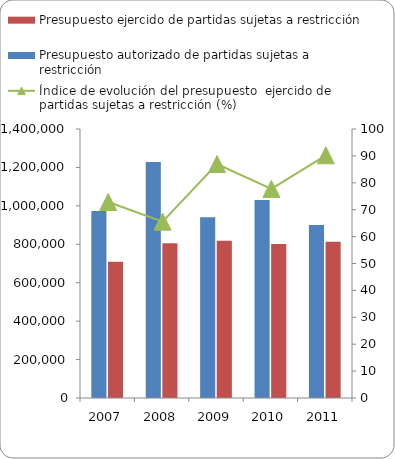
| Category | Presupuesto autorizado de partidas sujetas a restricción | Presupuesto ejercido de partidas sujetas a restricción  |
|---|---|---|
| 2007 | 973360 | 709175 |
| 2008 | 1227735 | 804875 |
| 2009 | 941182 | 818576 |
| 2010 | 1031124 | 801583 |
| 2011 | 900614 | 812630 |